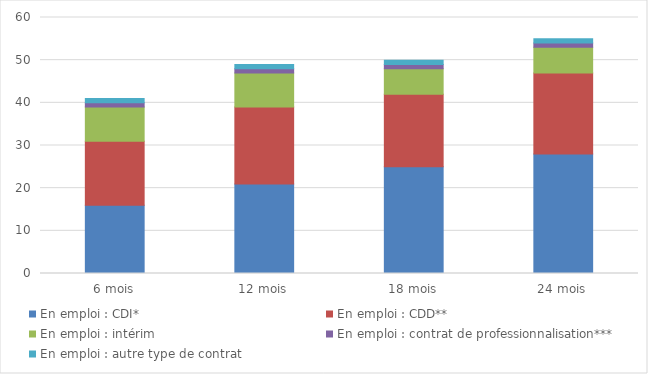
| Category | En emploi : CDI* | En emploi : CDD** | En emploi : intérim | En emploi : contrat de professionnalisation*** | En emploi : autre type de contrat |
|---|---|---|---|---|---|
| 6 mois | 16 | 15 | 8 | 1 | 1 |
| 12 mois | 21 | 18 | 8 | 1 | 1 |
| 18 mois | 25 | 17 | 6 | 1 | 1 |
| 24 mois | 28 | 19 | 6 | 1 | 1 |